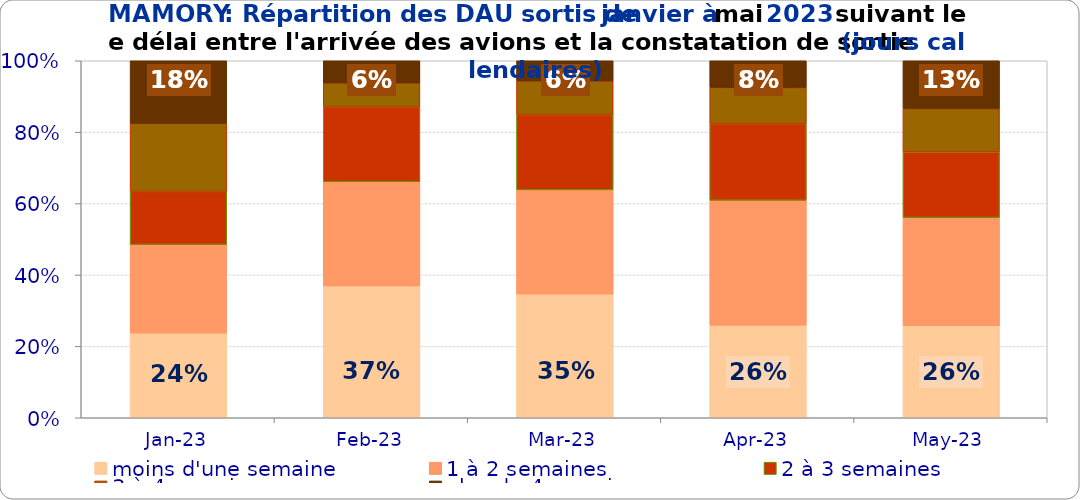
| Category | moins d'une semaine | 1 à 2 semaines | 2 à 3 semaines | 3 à 4 semaines | plus de 4 semaines |
|---|---|---|---|---|---|
| 2023-01-01 | 0.237 | 0.248 | 0.149 | 0.19 | 0.175 |
| 2023-02-01 | 0.369 | 0.292 | 0.21 | 0.066 | 0.062 |
| 2023-03-01 | 0.346 | 0.292 | 0.211 | 0.094 | 0.057 |
| 2023-04-01 | 0.259 | 0.35 | 0.215 | 0.101 | 0.075 |
| 2023-05-01 | 0.258 | 0.303 | 0.184 | 0.121 | 0.134 |